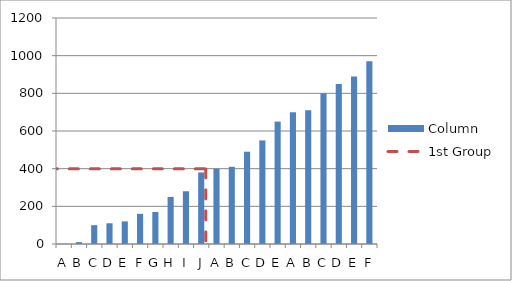
| Category | Column |
|---|---|
| A | 1 |
| B | 10 |
| C | 100 |
| D | 110 |
| E | 120 |
| F | 160 |
| G | 170 |
| H | 250 |
| I | 280 |
| J | 380 |
| A | 400 |
| B | 410 |
| C | 490 |
| D | 550 |
| E | 650 |
| A | 700 |
| B | 710 |
| C | 800 |
| D | 850 |
| E | 890 |
| F | 970 |